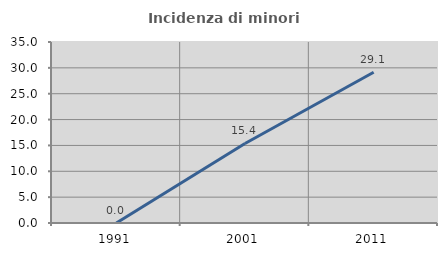
| Category | Incidenza di minori stranieri |
|---|---|
| 1991.0 | 0 |
| 2001.0 | 15.385 |
| 2011.0 | 29.139 |